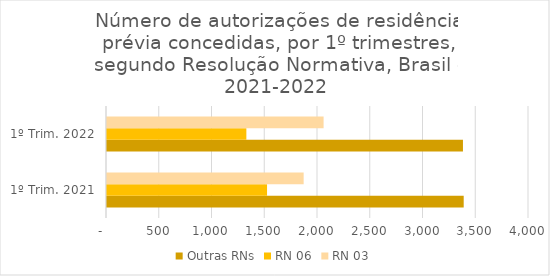
| Category | Outras RNs | RN 06 | RN 03 |
|---|---|---|---|
| 1º Trim. 2021 | 3381 | 1517 | 1864 |
| 1º Trim. 2022 | 3374 | 1321 | 2053 |